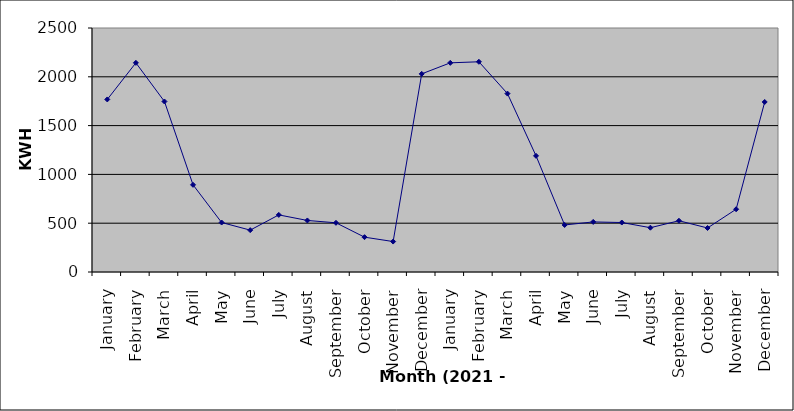
| Category | Series 0 |
|---|---|
| January | 1768 |
| February | 2143 |
| March | 1747 |
| April | 893 |
| May | 507 |
| June | 429 |
| July | 585 |
| August | 528 |
| September | 504 |
| October | 357 |
| November | 312 |
| December | 2030 |
| January | 2143 |
| February | 2154 |
| March | 1828 |
| April | 1190 |
| May | 482 |
| June | 513 |
| July | 507 |
| August | 454 |
| September | 525 |
| October | 451 |
| November | 643 |
| December | 1742 |